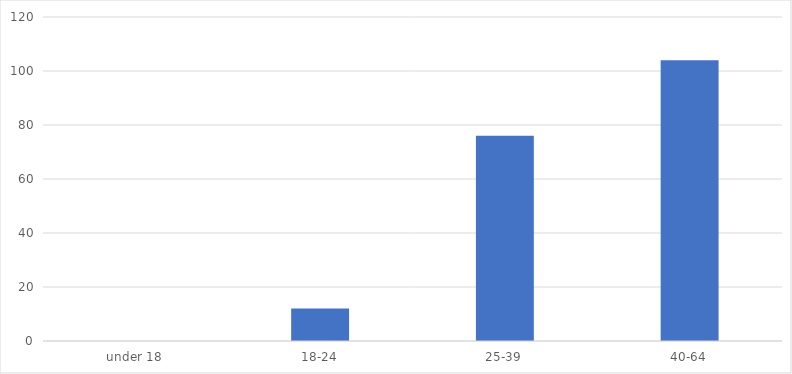
| Category | Number of Responses |
|---|---|
| under 18 | 0 |
| 18-24 | 12 |
| 25-39 | 76 |
| 40-64 | 104 |